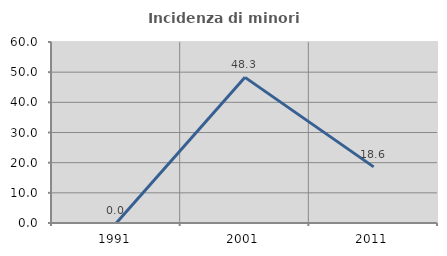
| Category | Incidenza di minori stranieri |
|---|---|
| 1991.0 | 0 |
| 2001.0 | 48.276 |
| 2011.0 | 18.605 |